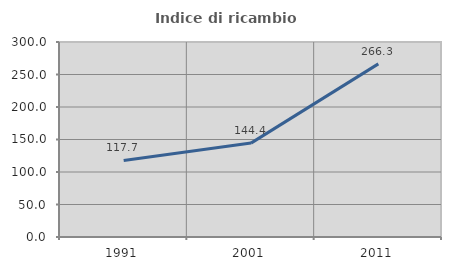
| Category | Indice di ricambio occupazionale  |
|---|---|
| 1991.0 | 117.739 |
| 2001.0 | 144.444 |
| 2011.0 | 266.313 |